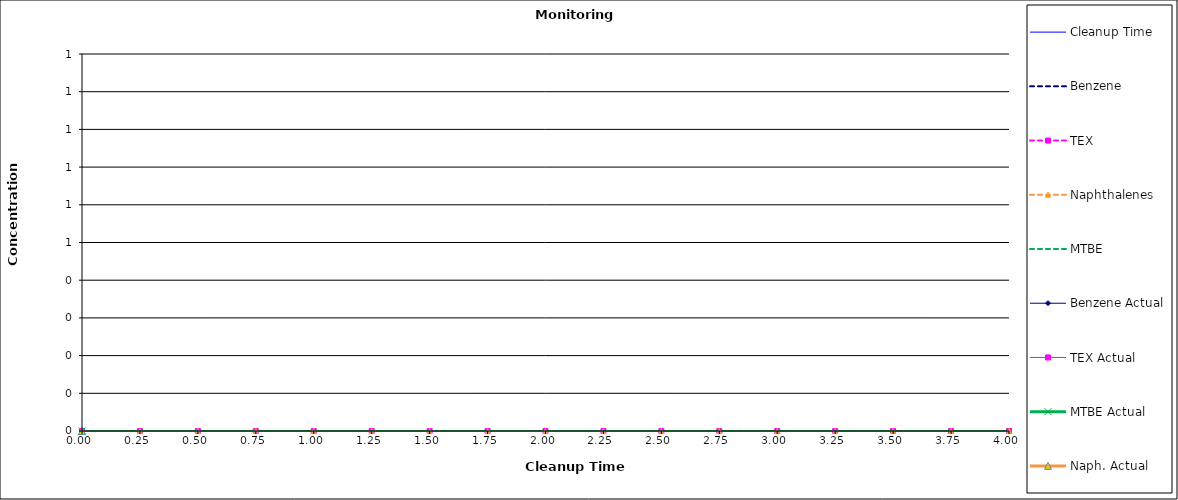
| Category | Cleanup Time |
|---|---|
| 0.0 | 0 |
| 0.0 | 0 |